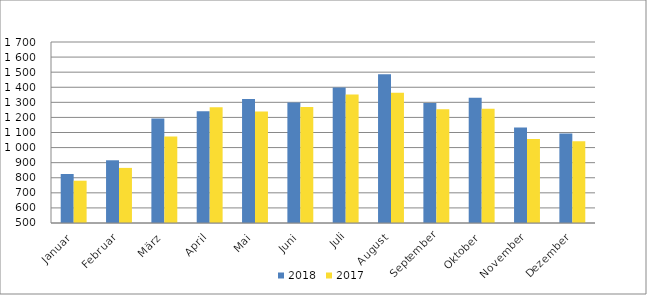
| Category | 2018 | 2017 |
|---|---|---|
| Januar | 824777 | 780382 |
| Februar | 915853 | 865255 |
| März | 1192189 | 1073065 |
| April | 1240759 | 1267940 |
| Mai | 1321686 | 1239911 |
| Juni | 1299390 | 1268497 |
| Juli | 1397788 | 1352242 |
| August | 1485602 | 1364292 |
| September | 1294916 | 1254235 |
| Oktober | 1330901 | 1258194 |
| November | 1132965 | 1057103 |
| Dezember | 1092723 | 1041221 |